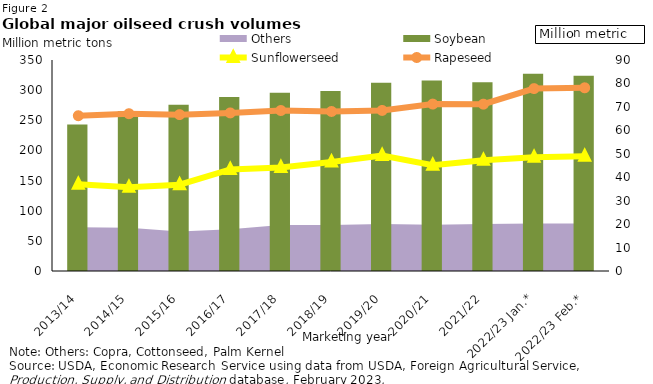
| Category | Soybean |
|---|---|
| 2013/14 | 243.122 |
| 2014/15 | 265.139 |
| 2015/16 | 275.645 |
| 2016/17 | 288.441 |
| 2017/18 | 295.495 |
| 2018/19 | 298.739 |
| 2019/20 | 312.101 |
| 2020/21 | 315.943 |
| 2021/22 | 312.887 |
| 2022/23 Jan.* | 327.323 |
| 2022/23 Feb.* | 323.897 |